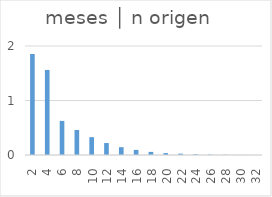
| Category | meses │ n origen |
|---|---|
| 2.0 | 1.854 |
| 4.0 | 1.561 |
| 6.0 | 0.626 |
| 8.0 | 0.459 |
| 10.0 | 0.328 |
| 12.0 | 0.22 |
| 14.0 | 0.144 |
| 16.0 | 0.094 |
| 18.0 | 0.057 |
| 20.0 | 0.035 |
| 22.0 | 0.024 |
| 24.0 | 0.013 |
| 26.0 | 0.007 |
| 28.0 | 0.004 |
| 30.0 | 0.001 |
| 32.0 | 0 |